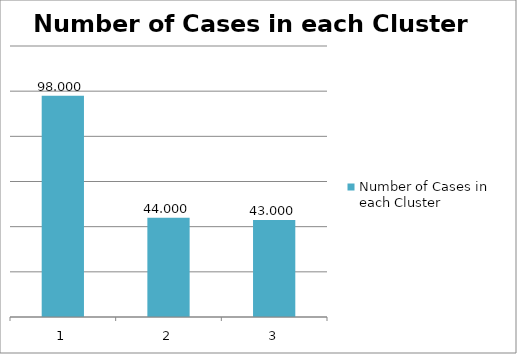
| Category | Number of Cases in each Cluster |
|---|---|
| 0 | 98 |
| 1 | 44 |
| 2 | 43 |